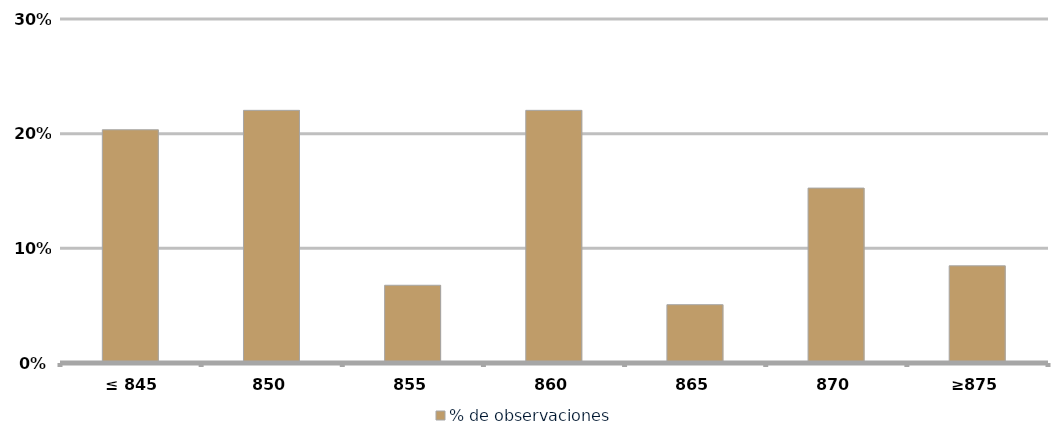
| Category | % de observaciones  |
|---|---|
|  ≤ 845  | 0.203 |
|  850  | 0.22 |
|  855  | 0.068 |
|  860  | 0.22 |
|  865  | 0.051 |
| 870 | 0.153 |
|  ≥875  | 0.085 |